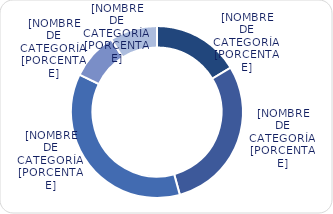
| Category | Series 0 |
|---|---|
| Menores de 3% | 2553.2 |
| Entre 3% y 6% | 4576.7 |
| Entre 6% y 8% | 5681.3 |
| Entre 8% y 9% | 1392 |
| Mayores de 9% | 1392.6 |